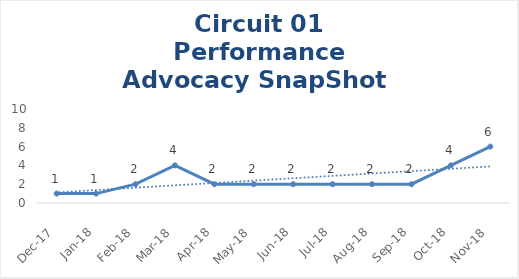
| Category | Circuit 01 |
|---|---|
| Dec-17 | 1 |
| Jan-18 | 1 |
| Feb-18 | 2 |
| Mar-18 | 4 |
| Apr-18 | 2 |
| May-18 | 2 |
| Jun-18 | 2 |
| Jul-18 | 2 |
| Aug-18 | 2 |
| Sep-18 | 2 |
| Oct-18 | 4 |
| Nov-18 | 6 |